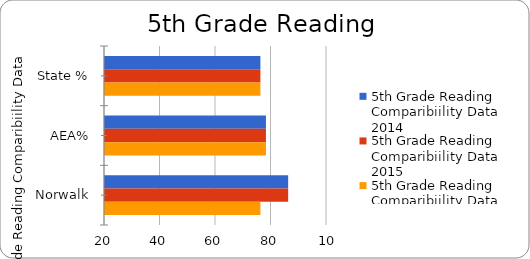
| Category | 5th Grade Reading Comparibiility Data 2014 | 5th Grade Reading Comparibiility Data 2015 | 5th Grade Reading Comparibiility Data 2016 |
|---|---|---|---|
| State % | 76 | 76 | 76 |
| AEA% | 78 | 78 | 78 |
| Norwalk | 86 | 86 | 76 |